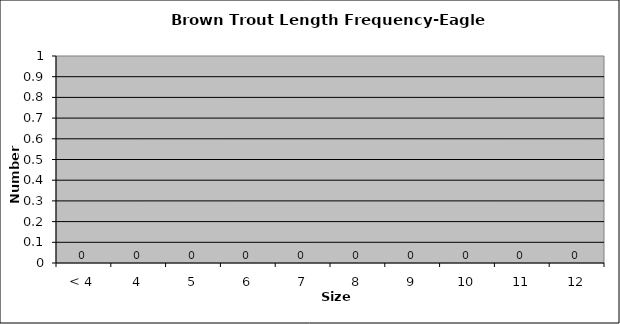
| Category | Series 0 |
|---|---|
| < 4 | 0 |
| 4 | 0 |
| 5 | 0 |
| 6 | 0 |
| 7 | 0 |
| 8 | 0 |
| 9 | 0 |
| 10 | 0 |
| 11 | 0 |
| 12 | 0 |